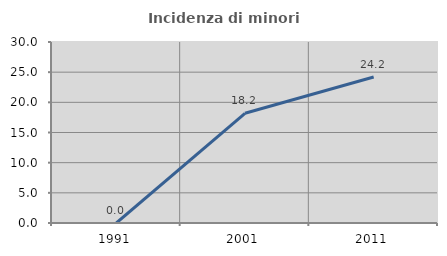
| Category | Incidenza di minori stranieri |
|---|---|
| 1991.0 | 0 |
| 2001.0 | 18.182 |
| 2011.0 | 24.194 |